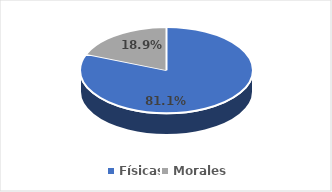
| Category | SOLICITUDES POR TIPO DE PERSONA |
|---|---|
| Físicas | 0.811 |
| Morales | 0.189 |